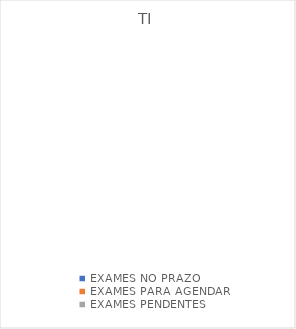
| Category | TI |
|---|---|
| EXAMES NO PRAZO | 0 |
| EXAMES PARA AGENDAR | 0 |
| EXAMES PENDENTES | 0 |